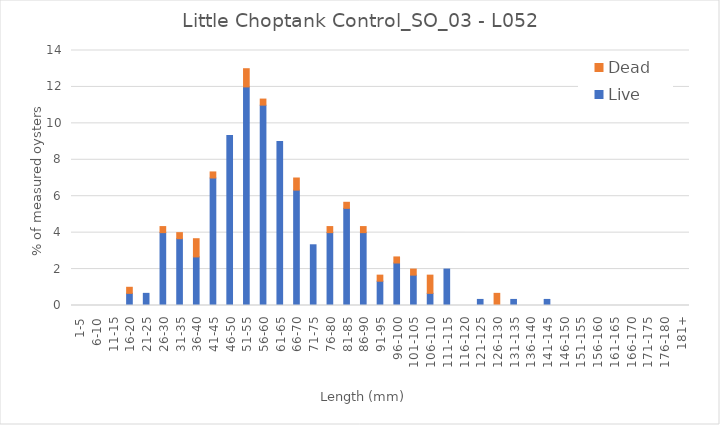
| Category | Live | Dead |
|---|---|---|
| 1-5 | 0 | 0 |
| 6-10 | 0 | 0 |
| 11-15 | 0 | 0 |
| 16-20 | 0.667 | 0.333 |
| 21-25 | 0.667 | 0 |
| 26-30 | 4 | 0.333 |
| 31-35 | 3.667 | 0.333 |
| 36-40 | 2.667 | 1 |
| 41-45 | 7 | 0.333 |
| 46-50 | 9.333 | 0 |
| 51-55 | 12 | 1 |
| 56-60 | 11 | 0.333 |
| 61-65 | 9 | 0 |
| 66-70 | 6.333 | 0.667 |
| 71-75 | 3.333 | 0 |
| 76-80 | 4 | 0.333 |
| 81-85 | 5.333 | 0.333 |
| 86-90 | 4 | 0.333 |
| 91-95 | 1.333 | 0.333 |
| 96-100 | 2.333 | 0.333 |
| 101-105 | 1.667 | 0.333 |
| 106-110 | 0.667 | 1 |
| 111-115 | 2 | 0 |
| 116-120 | 0 | 0 |
| 121-125 | 0.333 | 0 |
| 126-130 | 0 | 0.667 |
| 131-135 | 0.333 | 0 |
| 136-140 | 0 | 0 |
| 141-145 | 0.333 | 0 |
| 146-150 | 0 | 0 |
| 151-155 | 0 | 0 |
| 156-160 | 0 | 0 |
| 161-165 | 0 | 0 |
| 166-170 | 0 | 0 |
| 171-175 | 0 | 0 |
| 176-180 | 0 | 0 |
| 181+ | 0 | 0 |